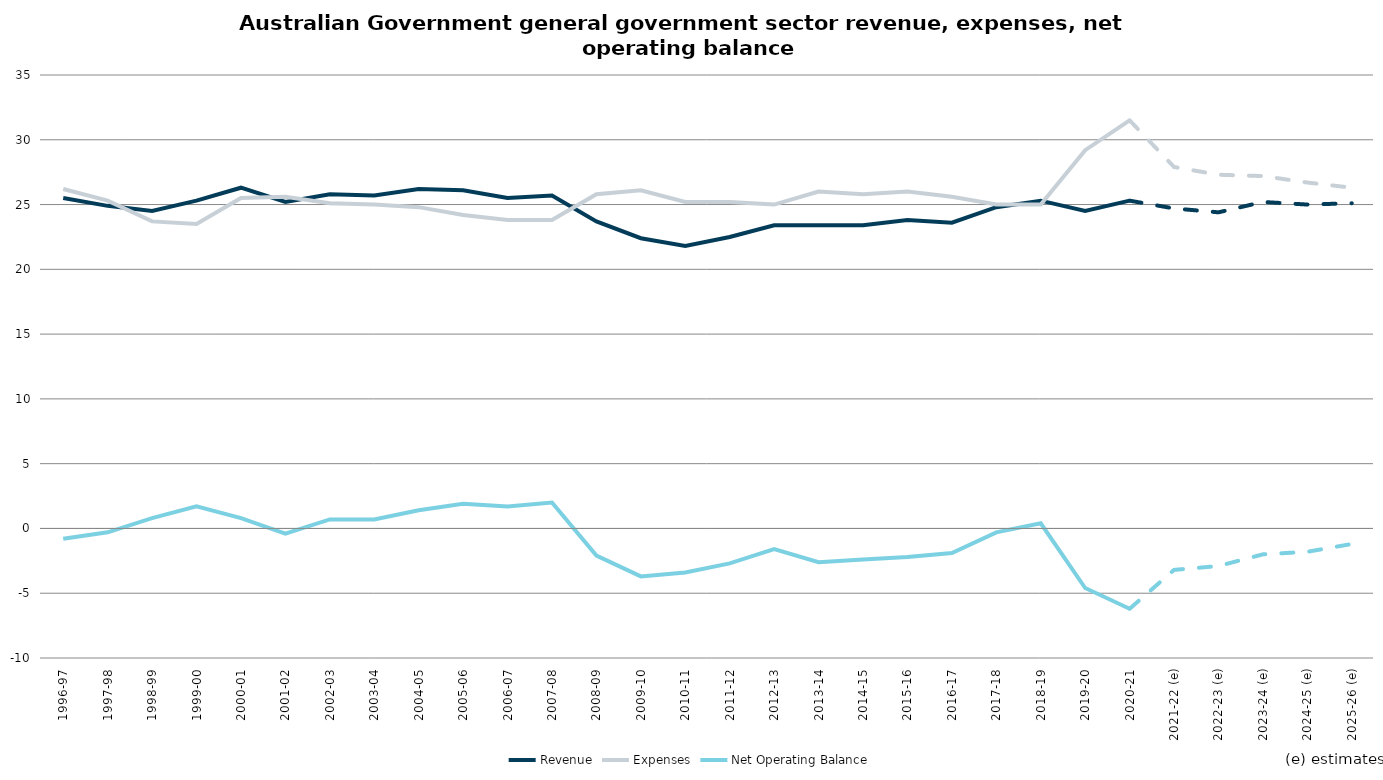
| Category | Revenue | Expenses | Net Operating Balance |
|---|---|---|---|
| 1996-97 | 25.5 | 26.2 | -0.8 |
| 1997-98 | 24.9 | 25.3 | -0.3 |
| 1998-99 | 24.5 | 23.7 | 0.8 |
| 1999-00 | 25.3 | 23.5 | 1.7 |
| 2000-01 | 26.3 | 25.5 | 0.8 |
| 2001-02 | 25.2 | 25.6 | -0.4 |
| 2002-03 | 25.8 | 25.1 | 0.7 |
| 2003-04 | 25.7 | 25 | 0.7 |
| 2004-05 | 26.2 | 24.8 | 1.4 |
| 2005-06 | 26.1 | 24.2 | 1.9 |
| 2006-07 | 25.5 | 23.8 | 1.7 |
| 2007-08 | 25.7 | 23.8 | 2 |
| 2008-09 | 23.7 | 25.8 | -2.1 |
| 2009-10 | 22.4 | 26.1 | -3.7 |
| 2010-11 | 21.8 | 25.2 | -3.4 |
| 2011-12 | 22.5 | 25.2 | -2.7 |
| 2012-13 | 23.4 | 25 | -1.6 |
| 2013-14 | 23.4 | 26 | -2.6 |
| 2014-15 | 23.4 | 25.8 | -2.4 |
| 2015-16 | 23.8 | 26 | -2.2 |
| 2016-17 | 23.6 | 25.6 | -1.9 |
| 2017-18 | 24.8 | 25 | -0.3 |
| 2018-19 | 25.3 | 25 | 0.4 |
| 2019-20 | 24.5 | 29.2 | -4.6 |
| 2020-21 | 25.3 | 31.5 | -6.2 |
| 2021-22 (e) | 24.7 | 27.9 | -3.2 |
| 2022-23 (e) | 24.4 | 27.3 | -2.9 |
| 2023-24 (e) | 25.2 | 27.2 | -2 |
| 2024-25 (e) | 25 | 26.7 | -1.8 |
| 2025-26 (e) | 25.1 | 26.3 | -1.2 |